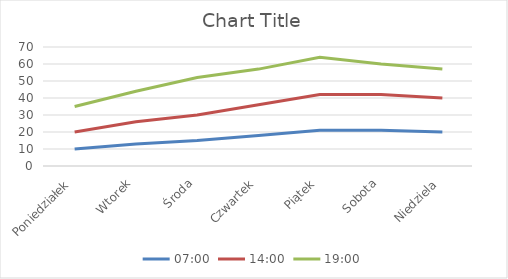
| Category | 07:00 | 14:00 | 19:00 |
|---|---|---|---|
| Poniedziałek | 10 | 10 | 15 |
| Wtorek | 13 | 13 | 18 |
| Środa | 15 | 15 | 22 |
| Czwartek | 18 | 18 | 21 |
| Piątek | 21 | 21 | 22 |
| Sobota | 21 | 21 | 18 |
| Niedziela | 20 | 20 | 17 |